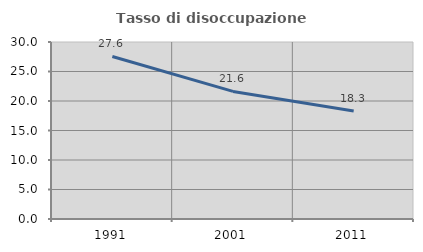
| Category | Tasso di disoccupazione giovanile  |
|---|---|
| 1991.0 | 27.551 |
| 2001.0 | 21.622 |
| 2011.0 | 18.31 |